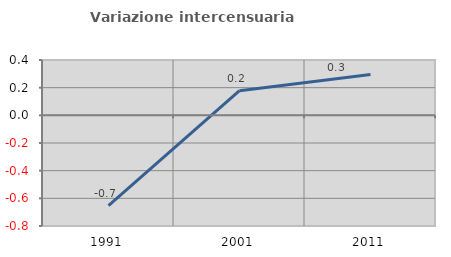
| Category | Variazione intercensuaria annua |
|---|---|
| 1991.0 | -0.653 |
| 2001.0 | 0.178 |
| 2011.0 | 0.295 |